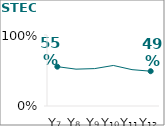
| Category | STEC 2b |
|---|---|
| Y₇ | 0.554 |
| Y₈ | 0.519 |
| Y₉ | 0.527 |
| Y₁₀ | 0.571 |
| Y₁₁ | 0.512 |
| Y₁₂ | 0.49 |